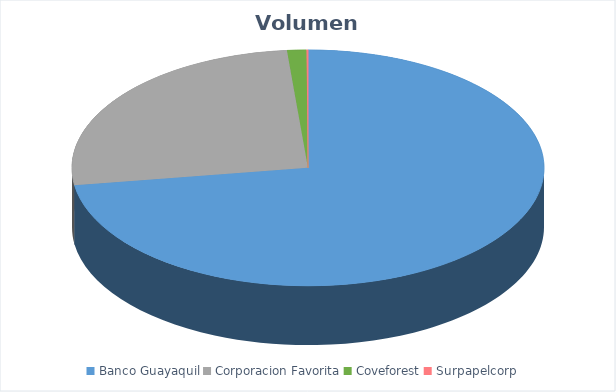
| Category | VOLUMEN ($USD) |
|---|---|
| Banco Guayaquil | 232306.4 |
| Corporacion Favorita | 82882.72 |
| Coveforest | 4196.4 |
| Surpapelcorp | 340 |